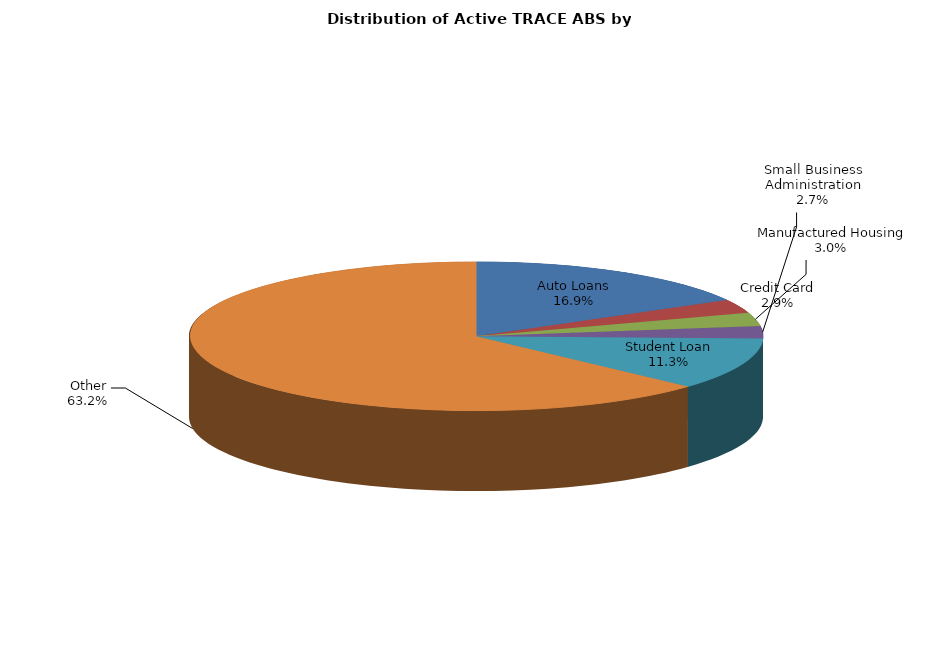
| Category | Series 0 |
|---|---|
| Auto Loans | 1987 |
| Credit Card | 346 |
| Manufactured Housing | 348 |
| Small Business Administration | 314 |
| Student Loan | 1332 |
| Other | 7429 |